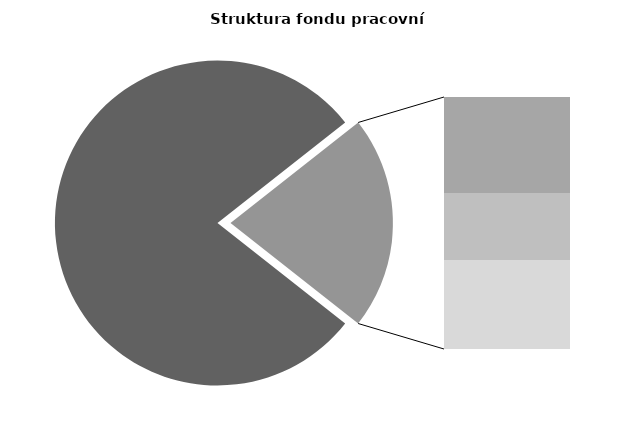
| Category | Series 0 |
|---|---|
| Průměrná měsíční odpracovaná doba bez přesčasu | 134.275 |
| Dovolená | 13.79 |
| Nemoc | 9.613 |
| Jiné | 12.784 |